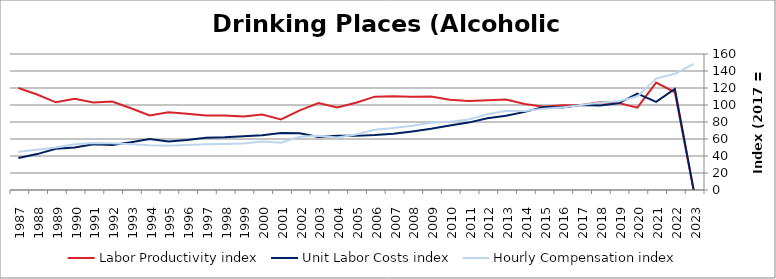
| Category | Labor Productivity index | Unit Labor Costs index | Hourly Compensation index |
|---|---|---|---|
| 2023.0 | 0 | 0 | 148.491 |
| 2022.0 | 115.008 | 118.87 | 136.71 |
| 2021.0 | 126.391 | 103.687 | 131.051 |
| 2020.0 | 96.867 | 113.531 | 109.974 |
| 2019.0 | 102.378 | 102.032 | 104.458 |
| 2018.0 | 103.372 | 99.446 | 102.799 |
| 2017.0 | 100 | 100 | 100 |
| 2016.0 | 99.833 | 97.153 | 96.991 |
| 2015.0 | 98.026 | 97.554 | 95.628 |
| 2014.0 | 101.124 | 91.91 | 92.943 |
| 2013.0 | 106.446 | 87.474 | 93.113 |
| 2012.0 | 105.72 | 84.393 | 89.22 |
| 2011.0 | 104.67 | 79.293 | 82.996 |
| 2010.0 | 106.103 | 75.81 | 80.436 |
| 2009.0 | 109.997 | 71.952 | 79.144 |
| 2008.0 | 109.628 | 68.889 | 75.522 |
| 2007.0 | 110.329 | 66.113 | 72.941 |
| 2006.0 | 109.837 | 64.606 | 70.961 |
| 2005.0 | 102.658 | 63.677 | 65.369 |
| 2004.0 | 97.013 | 63.813 | 61.907 |
| 2003.0 | 102.292 | 62.463 | 63.895 |
| 2002.0 | 93.685 | 66.881 | 62.658 |
| 2001.0 | 83.101 | 67.02 | 55.694 |
| 2000.0 | 88.714 | 64.295 | 57.038 |
| 1999.0 | 86.552 | 63.179 | 54.683 |
| 1998.0 | 87.574 | 61.914 | 54.22 |
| 1997.0 | 87.669 | 61.499 | 53.915 |
| 1996.0 | 89.817 | 58.878 | 52.883 |
| 1995.0 | 91.346 | 57.128 | 52.185 |
| 1994.0 | 87.719 | 60.017 | 52.646 |
| 1993.0 | 96.126 | 56.062 | 53.89 |
| 1992.0 | 104.068 | 52.98 | 55.135 |
| 1991.0 | 102.966 | 53.812 | 55.408 |
| 1990.0 | 107.266 | 50.086 | 53.725 |
| 1989.0 | 103.147 | 48.425 | 49.949 |
| 1988.0 | 112.31 | 42.246 | 47.446 |
| 1987.0 | 119.968 | 37.61 | 45.12 |